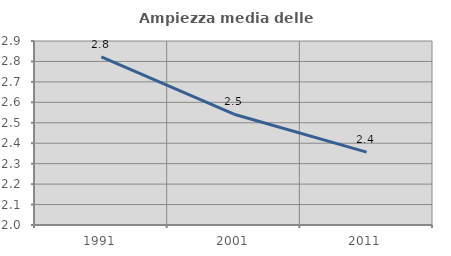
| Category | Ampiezza media delle famiglie |
|---|---|
| 1991.0 | 2.823 |
| 2001.0 | 2.542 |
| 2011.0 | 2.356 |